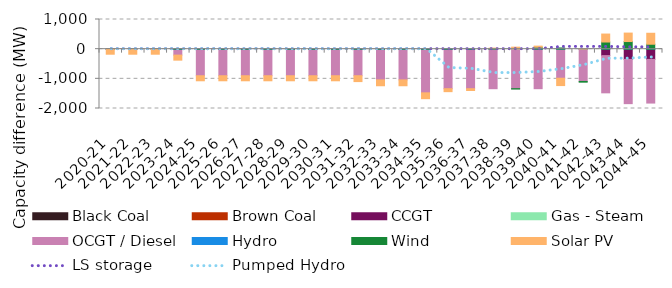
| Category | Black Coal | Brown Coal | CCGT | Gas - Steam | OCGT / Diesel | Hydro | Wind | Solar PV |
|---|---|---|---|---|---|---|---|---|
| 2020-21 | 0 | 0 | 0 | 0 | 0 | 0 | 0.003 | -170.29 |
| 2021-22 | 0 | 0 | 0 | 0 | 0 | 0 | 0.004 | -170.29 |
| 2022-23 | 0 | 0 | 0.001 | 0 | 0 | 0 | 0.004 | -170.289 |
| 2023-24 | 0 | 0 | 0 | 0 | -199.928 | 0 | 0.005 | -170.289 |
| 2024-25 | 0 | 0 | 0 | 0 | -895.365 | 0 | 0.005 | -170.29 |
| 2025-26 | 0 | 0 | 0 | 0 | -895.365 | 0 | 0.004 | -170.29 |
| 2026-27 | 0 | 0 | 0 | 0 | -895.365 | 0 | 0.004 | -170.291 |
| 2027-28 | 0 | 0 | 0 | 0 | -895.365 | 0 | 0.005 | -170.291 |
| 2028-29 | 0 | 0 | 0 | 0 | -895.365 | 0 | 0.005 | -170.291 |
| 2029-30 | 0 | 0 | 0 | 0 | -895.365 | 0 | 0.005 | -170.29 |
| 2030-31 | 0 | 0 | 0 | 0 | -895.365 | 0 | 0.006 | -170.29 |
| 2031-32 | 0 | 0 | 0 | 0 | -895.365 | 0 | 0.007 | -197.659 |
| 2032-33 | 0 | 0 | 0 | 0 | -1035.604 | 0 | 0.007 | -197.659 |
| 2033-34 | 0 | 0 | 0 | 0 | -1035.604 | 0 | 0.007 | -197.657 |
| 2034-35 | 0 | 0 | 0 | 0 | -1471.591 | 0 | 0.008 | -197.655 |
| 2035-36 | 0 | 0 | 0 | 0 | -1332.249 | 0 | 0.026 | -99.765 |
| 2036-37 | 0 | 0 | 0.001 | 0 | -1332.25 | 0 | 8.722 | -60.354 |
| 2037-38 | 0 | 0 | 0.001 | 0 | -1332.25 | 0 | 14.373 | 21.253 |
| 2038-39 | 0 | 0 | 0.001 | 0 | -1332.25 | 0 | -11.477 | 67.836 |
| 2039-40 | 0 | 0 | 0.001 | 0 | -1332.25 | 0 | 66.143 | 36.263 |
| 2040-41 | 0 | 0 | 0.001 | 0 | -979.318 | 0 | 40.92 | -248.132 |
| 2041-42 | 0 | 0 | 0.001 | 0 | -1088.125 | 0 | -24.263 | 19.842 |
| 2042-43 | 0 | 0 | -217.019 | 0 | -1254.767 | 0 | 241.096 | 268.604 |
| 2043-44 | 0 | 0 | -345.2 | 0 | -1491.175 | 0 | 256.962 | 285.019 |
| 2044-45 | 0 | 0 | -345.2 | 0 | -1471.719 | 0 | 166.04 | 369.92 |